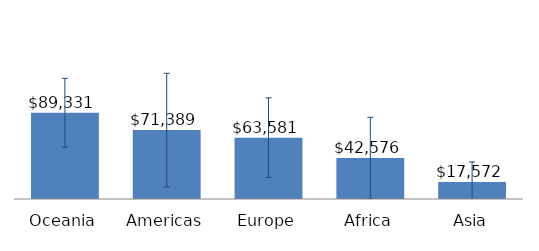
| Category | Total |
|---|---|
| Oceania | 89331.056 |
| Americas | 71388.879 |
| Europe | 63581.414 |
| Africa | 42575.941 |
| Asia | 17572.413 |